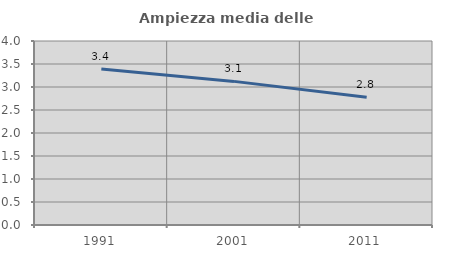
| Category | Ampiezza media delle famiglie |
|---|---|
| 1991.0 | 3.392 |
| 2001.0 | 3.122 |
| 2011.0 | 2.776 |